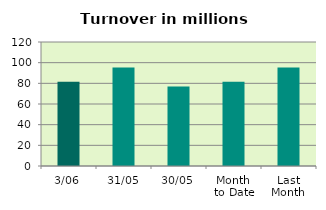
| Category | Series 0 |
|---|---|
| 3/06 | 81.595 |
| 31/05 | 95.388 |
| 30/05 | 77.003 |
| Month 
to Date | 81.595 |
| Last
Month | 95.269 |